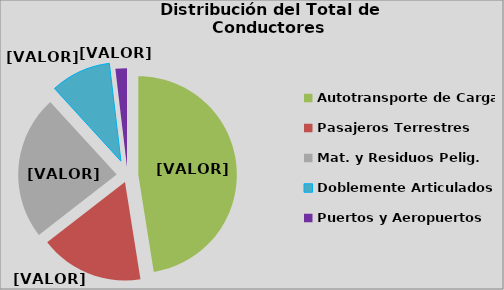
| Category | Series 0 |
|---|---|
| Autotransporte de Carga | 47.484 |
| Pasajeros Terrestres | 17.009 |
| Mat. y Residuos Pelig. | 23.72 |
| Doblemente Articulados | 9.906 |
| Puertos y Aeropuertos | 1.882 |